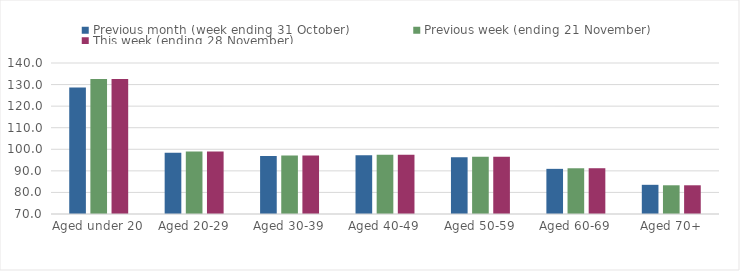
| Category | Previous month (week ending 31 October) | Previous week (ending 21 November) | This week (ending 28 November) |
|---|---|---|---|
| Aged under 20 | 128.66 | 132.59 | 132.59 |
| Aged 20-29 | 98.36 | 99.02 | 99.02 |
| Aged 30-39 | 96.91 | 97.17 | 97.17 |
| Aged 40-49 | 97.2 | 97.45 | 97.45 |
| Aged 50-59 | 96.36 | 96.54 | 96.54 |
| Aged 60-69 | 90.93 | 91.2 | 91.22 |
| Aged 70+ | 83.53 | 83.31 | 83.31 |